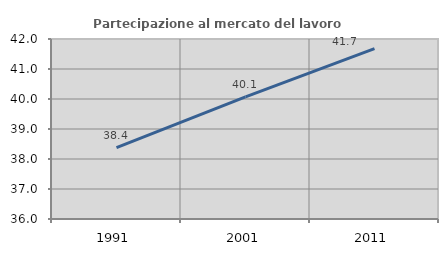
| Category | Partecipazione al mercato del lavoro  femminile |
|---|---|
| 1991.0 | 38.378 |
| 2001.0 | 40.068 |
| 2011.0 | 41.681 |